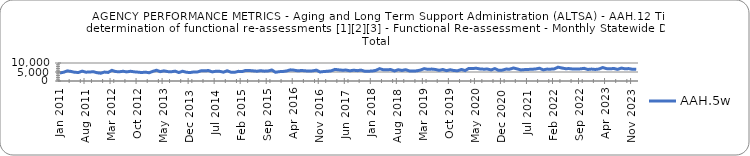
| Category | AAH.5w |
|---|---|
| 2011-01-01 | 4498 |
| 2011-02-01 | 4845 |
| 2011-03-01 | 5638 |
| 2011-04-01 | 5305 |
| 2011-05-01 | 4839 |
| 2011-06-01 | 4737 |
| 2011-07-01 | 5469 |
| 2011-08-01 | 4903 |
| 2011-09-01 | 4991 |
| 2011-10-01 | 5163 |
| 2011-11-01 | 4601 |
| 2011-12-01 | 4322 |
| 2012-01-01 | 4963 |
| 2012-02-01 | 4760 |
| 2012-03-01 | 5943 |
| 2012-04-01 | 5242 |
| 2012-05-01 | 5131 |
| 2012-06-01 | 5416 |
| 2012-07-01 | 5060 |
| 2012-08-01 | 5395 |
| 2012-09-01 | 5095 |
| 2012-10-01 | 4920 |
| 2012-11-01 | 4706 |
| 2012-12-01 | 4930 |
| 2013-01-01 | 4573 |
| 2013-02-01 | 5353 |
| 2013-03-01 | 5984 |
| 2013-04-01 | 5188 |
| 2013-05-01 | 5650 |
| 2013-06-01 | 5212 |
| 2013-07-01 | 5133 |
| 2013-08-01 | 5480 |
| 2013-09-01 | 4696 |
| 2013-10-01 | 5433 |
| 2013-11-01 | 4867 |
| 2013-12-01 | 4691 |
| 2014-01-01 | 5032 |
| 2014-02-01 | 5034 |
| 2014-03-01 | 5671 |
| 2014-04-01 | 5718 |
| 2014-05-01 | 5793 |
| 2014-06-01 | 5061 |
| 2014-07-01 | 5447 |
| 2014-08-01 | 5367 |
| 2014-09-01 | 4904 |
| 2014-10-01 | 5698 |
| 2014-11-01 | 4895 |
| 2014-12-01 | 4811 |
| 2015-01-01 | 5363 |
| 2015-02-01 | 5239 |
| 2015-03-01 | 5878 |
| 2015-04-01 | 5833 |
| 2015-05-01 | 5636 |
| 2015-06-01 | 5436 |
| 2015-07-01 | 5721 |
| 2015-08-01 | 5472 |
| 2015-09-01 | 5572 |
| 2015-10-01 | 6117 |
| 2015-11-01 | 4834 |
| 2015-12-01 | 5194 |
| 2016-01-01 | 5287 |
| 2016-02-01 | 5586 |
| 2016-03-01 | 6192 |
| 2016-04-01 | 6020 |
| 2016-05-01 | 5631 |
| 2016-06-01 | 5850 |
| 2016-07-01 | 5658 |
| 2016-08-01 | 5491 |
| 2016-09-01 | 5637 |
| 2016-10-01 | 6021 |
| 2016-11-01 | 5024 |
| 2016-12-01 | 5264 |
| 2017-01-01 | 5416 |
| 2017-02-01 | 5646 |
| 2017-03-01 | 6444 |
| 2017-04-01 | 6185 |
| 2017-05-01 | 5997 |
| 2017-06-01 | 6074 |
| 2017-07-01 | 5639 |
| 2017-08-01 | 6004 |
| 2017-09-01 | 5745 |
| 2017-10-01 | 6049 |
| 2017-11-01 | 5428 |
| 2017-12-01 | 5451 |
| 2018-01-01 | 5526 |
| 2018-02-01 | 5901 |
| 2018-03-01 | 6874 |
| 2018-04-01 | 6200 |
| 2018-05-01 | 6267 |
| 2018-06-01 | 6350 |
| 2018-07-01 | 5575 |
| 2018-08-01 | 6283 |
| 2018-09-01 | 5852 |
| 2018-10-01 | 6294 |
| 2018-11-01 | 5589 |
| 2018-12-01 | 5547 |
| 2019-01-01 | 5646 |
| 2019-02-01 | 6095 |
| 2019-03-01 | 6870 |
| 2019-04-01 | 6460 |
| 2019-05-01 | 6618 |
| 2019-06-01 | 6408 |
| 2019-07-01 | 5933 |
| 2019-08-01 | 6384 |
| 2019-09-01 | 5741 |
| 2019-10-01 | 6245 |
| 2019-11-01 | 5813 |
| 2019-12-01 | 5690 |
| 2020-01-01 | 6417 |
| 2020-02-01 | 5801 |
| 2020-03-01 | 6995 |
| 2020-04-01 | 6936 |
| 2020-05-01 | 7081 |
| 2020-06-01 | 6709 |
| 2020-07-01 | 6570 |
| 2020-08-01 | 6624 |
| 2020-09-01 | 6161 |
| 2020-10-01 | 6894 |
| 2020-11-01 | 5939 |
| 2020-12-01 | 6044 |
| 2021-01-01 | 6605 |
| 2021-02-01 | 6580 |
| 2021-03-01 | 7234 |
| 2021-04-01 | 6718 |
| 2021-05-01 | 6149 |
| 2021-06-01 | 6338 |
| 2021-07-01 | 6432 |
| 2021-08-01 | 6525 |
| 2021-09-01 | 6690 |
| 2021-10-01 | 7106 |
| 2021-11-01 | 6200 |
| 2021-12-01 | 6603 |
| 2022-01-01 | 6567 |
| 2022-02-01 | 6729 |
| 2022-03-01 | 7689 |
| 2022-04-01 | 7224 |
| 2022-05-01 | 6850 |
| 2022-06-01 | 6895 |
| 2022-07-01 | 6643 |
| 2022-08-01 | 6685 |
| 2022-09-01 | 6741 |
| 2022-10-01 | 7037 |
| 2022-11-01 | 6413 |
| 2022-12-01 | 6625 |
| 2023-01-01 | 6419 |
| 2023-02-01 | 6656 |
| 2023-03-01 | 7488 |
| 2023-04-01 | 6880 |
| 2023-05-01 | 6756 |
| 2023-06-01 | 6971 |
| 2023-07-01 | 6459 |
| 2023-08-01 | 7173 |
| 2023-09-01 | 6779 |
| 2023-10-01 | 6902 |
| 2023-11-01 | 6498 |
| 2023-12-01 | 6474 |